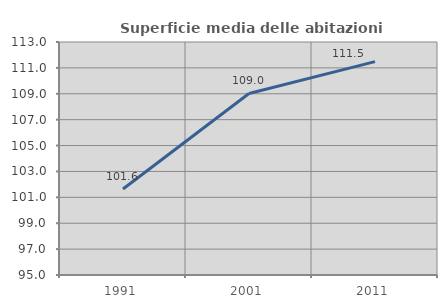
| Category | Superficie media delle abitazioni occupate |
|---|---|
| 1991.0 | 101.643 |
| 2001.0 | 109.024 |
| 2011.0 | 111.484 |